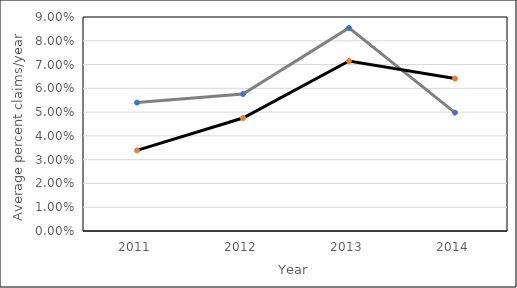
| Category | 6 | 7 |
|---|---|---|
| 0 | 0.054 | 0.034 |
| 1 | 0.058 | 0.048 |
| 2 | 0.085 | 0.072 |
| 3 | 0.05 | 0.064 |